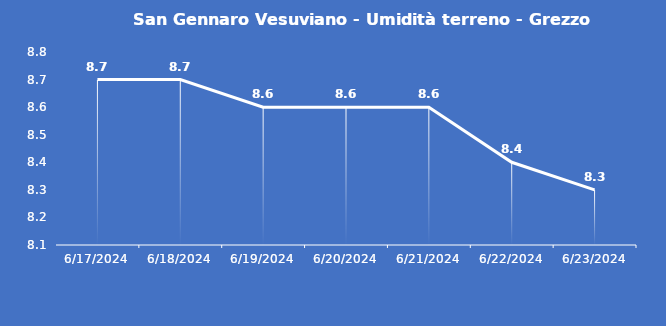
| Category | San Gennaro Vesuviano - Umidità terreno - Grezzo (%VWC) |
|---|---|
| 6/17/24 | 8.7 |
| 6/18/24 | 8.7 |
| 6/19/24 | 8.6 |
| 6/20/24 | 8.6 |
| 6/21/24 | 8.6 |
| 6/22/24 | 8.4 |
| 6/23/24 | 8.3 |